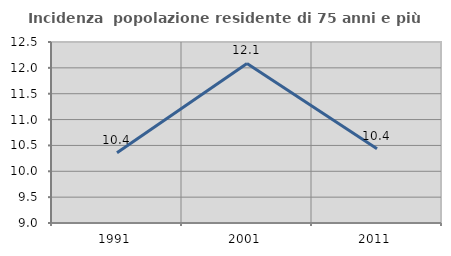
| Category | Incidenza  popolazione residente di 75 anni e più |
|---|---|
| 1991.0 | 10.359 |
| 2001.0 | 12.086 |
| 2011.0 | 10.435 |